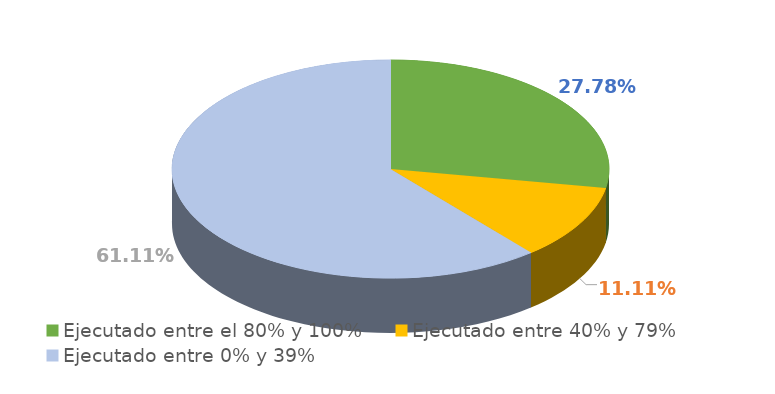
| Category | Series 0 |
|---|---|
| Ejecutado entre el 80% y 100% | 0.278 |
| Ejecutado entre 40% y 79% | 0.111 |
| Ejecutado entre 0% y 39% | 0.611 |